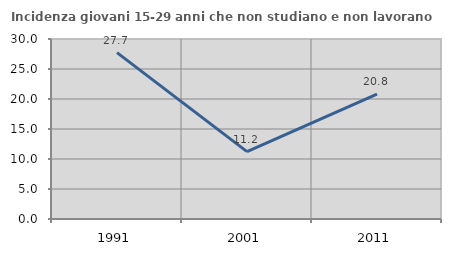
| Category | Incidenza giovani 15-29 anni che non studiano e non lavorano  |
|---|---|
| 1991.0 | 27.731 |
| 2001.0 | 11.223 |
| 2011.0 | 20.82 |